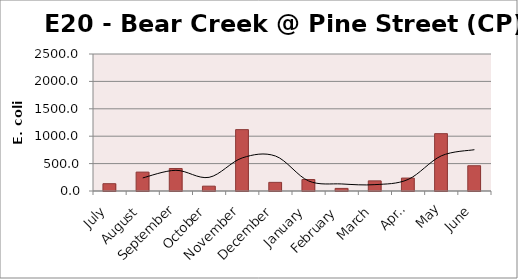
| Category | E. coli MPN |
|---|---|
| July | 133.3 |
| August | 344.8 |
| September | 410.6 |
| October | 88.2 |
| November | 1119.9 |
| December | 157.6 |
| January | 209.8 |
| February | 47.4 |
| March | 185 |
| April | 235.9 |
| May | 1046.2 |
| June | 461.1 |